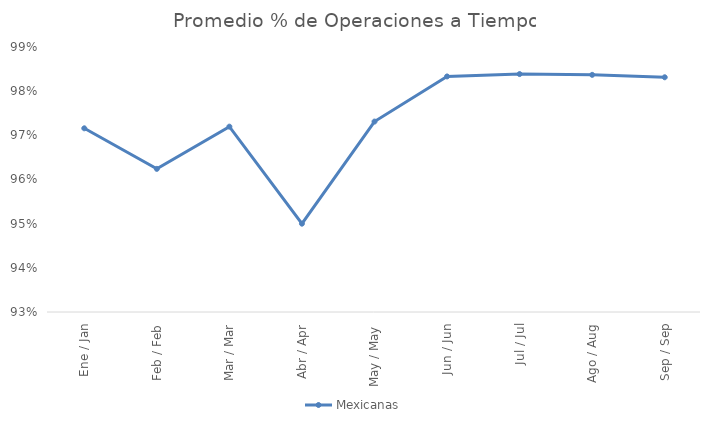
| Category | Mexicanas |
|---|---|
| Ene / Jan | 0.972 |
| Feb / Feb | 0.962 |
| Mar / Mar | 0.972 |
| Abr / Apr | 0.95 |
| May / May | 0.973 |
| Jun / Jun | 0.983 |
| Jul / Jul | 0.984 |
| Ago / Aug | 0.984 |
| Sep / Sep | 0.983 |